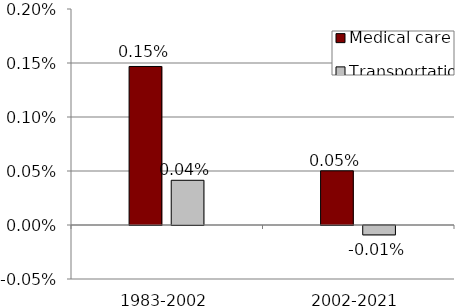
| Category | Medical care | Transportation |
|---|---|---|
| 1983-2002 | 0.001 | 0 |
| 2002-2021 | 0.001 | 0 |